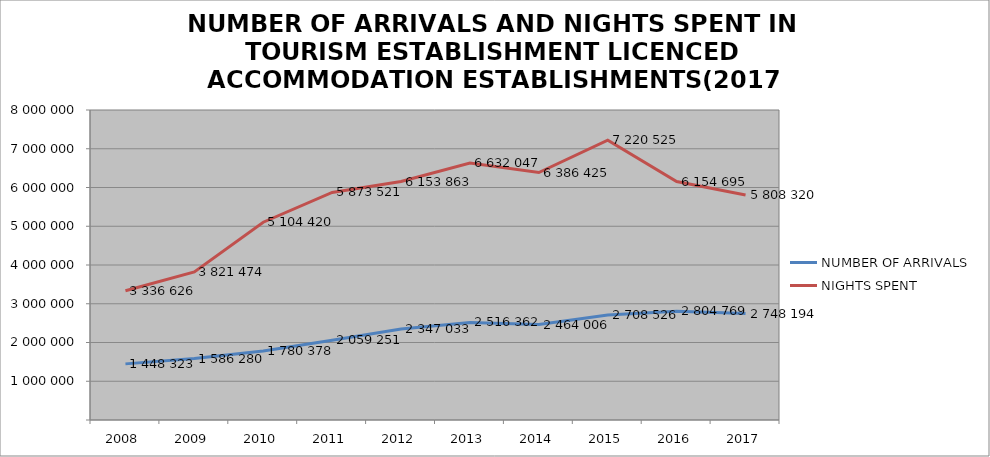
| Category | NUMBER OF ARRIVALS | NIGHTS SPENT |
|---|---|---|
| 2008 | 1448323 | 3336626 |
| 2009 | 1586280 | 3821474 |
| 2010 | 1780378 | 5104420 |
| 2011 | 2059251 | 5873521 |
| 2012 | 2347033 | 6153863 |
| 2013 | 2516362 | 6632047 |
| 2014 | 2464006 | 6386425 |
| 2015 | 2708526 | 7220525 |
| 2016 | 2804769 | 6154695 |
| 2017 | 2748194 | 5808320 |